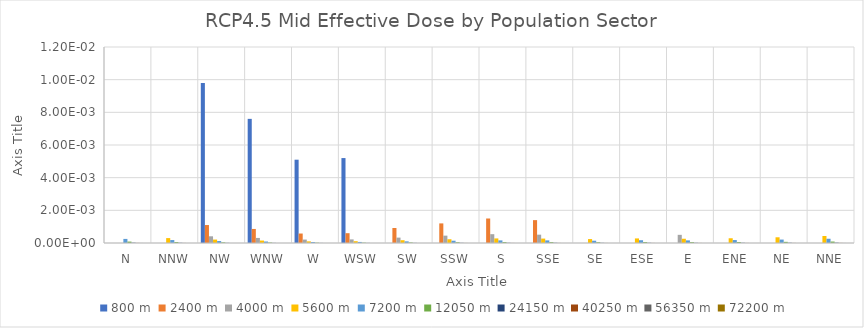
| Category | 800 m | 2400 m | 4000 m | 5600 m | 7200 m | 12050 m | 24150 m | 40250 m | 56350 m | 72200 m |
|---|---|---|---|---|---|---|---|---|---|---|
| N | 0 | 0 | 0 | 0 | 0 | 0 | 0 | 0 | 0 | 0 |
| NNW | 0 | 0 | 0 | 0 | 0 | 0 | 0 | 0 | 0 | 0 |
| NW | 0.01 | 0.001 | 0 | 0 | 0 | 0 | 0 | 0 | 0 | 0 |
| WNW | 0.008 | 0.001 | 0 | 0 | 0 | 0 | 0 | 0 | 0 | 0 |
| W | 0.005 | 0.001 | 0 | 0 | 0 | 0 | 0 | 0 | 0 | 0 |
| WSW | 0.005 | 0.001 | 0 | 0 | 0 | 0 | 0 | 0 | 0 | 0 |
| SW | 0 | 0.001 | 0 | 0 | 0 | 0 | 0 | 0 | 0 | 0 |
| SSW | 0 | 0.001 | 0 | 0 | 0 | 0 | 0 | 0 | 0 | 0 |
| S | 0 | 0.002 | 0.001 | 0 | 0 | 0 | 0 | 0 | 0 | 0 |
| SSE | 0 | 0.001 | 0.001 | 0 | 0 | 0 | 0 | 0 | 0 | 0 |
| SE | 0 | 0 | 0 | 0 | 0 | 0 | 0 | 0 | 0 | 0 |
| ESE | 0 | 0 | 0 | 0 | 0 | 0 | 0 | 0 | 0 | 0 |
| E | 0 | 0 | 0 | 0 | 0 | 0 | 0 | 0 | 0 | 0 |
| ENE | 0 | 0 | 0 | 0 | 0 | 0 | 0 | 0 | 0 | 0 |
| NE | 0 | 0 | 0 | 0 | 0 | 0 | 0 | 0 | 0 | 0 |
| NNE | 0 | 0 | 0 | 0 | 0 | 0 | 0 | 0 | 0 | 0 |